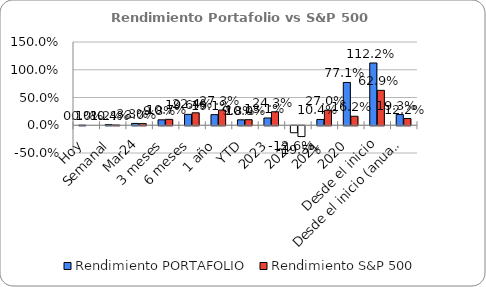
| Category | Rendimiento PORTAFOLIO | Rendimiento S&P 500 |
|---|---|---|
| Hoy | 0.001 | 0 |
| Semanal | 0.012 | 0.004 |
| Mar24 | 0.033 | 0.03 |
| 3 meses | 0.098 | 0.107 |
| 6 meses | 0.196 | 0.224 |
| 1 año | 0.191 | 0.273 |
| YTD | 0.098 | 0.1 |
| 2023 | 0.131 | 0.243 |
| 2022 | -0.126 | -0.195 |
| 2021 | 0.104 | 0.27 |
| 2020 | 0.771 | 0.162 |
| Desde el inicio | 1.122 | 0.629 |
| Desde el inicio (anual) | 0.193 | 0.122 |